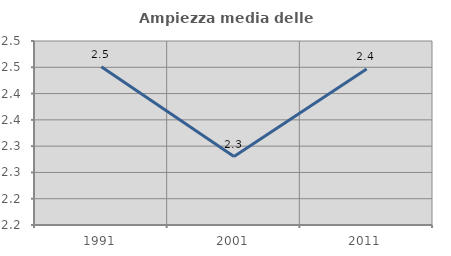
| Category | Ampiezza media delle famiglie |
|---|---|
| 1991.0 | 2.451 |
| 2001.0 | 2.28 |
| 2011.0 | 2.447 |